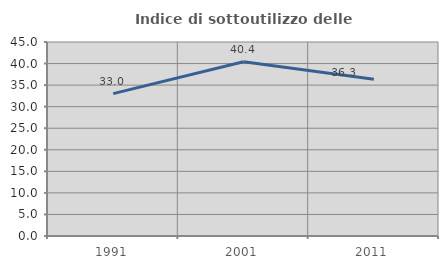
| Category | Indice di sottoutilizzo delle abitazioni  |
|---|---|
| 1991.0 | 33.015 |
| 2001.0 | 40.405 |
| 2011.0 | 36.339 |